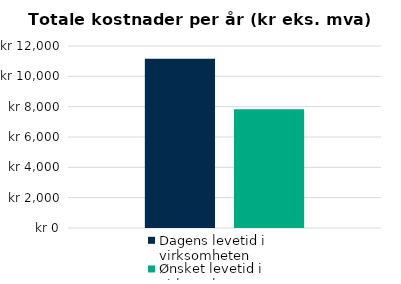
| Category | Dagens levetid i virksomheten | Ønsket levetid i virksomheten |
|---|---|---|
| Totalt | 11166.667 | 7833.333 |